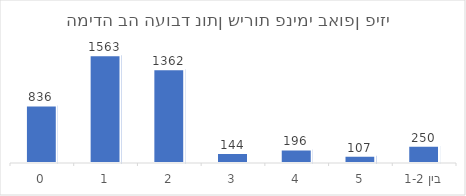
| Category | סה"כ |
|---|---|
| 0 | 836 |
| 1 | 1563 |
| 2 | 1362 |
| 3 | 144 |
| 4 | 196 |
| 5 | 107 |
| בין 1-2 | 250 |